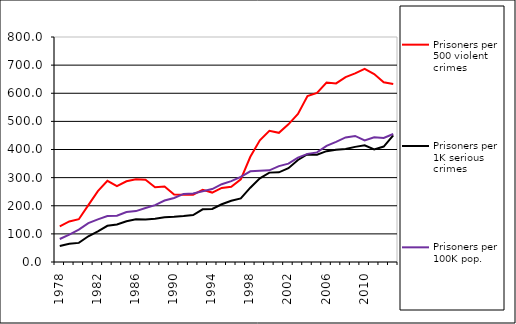
| Category | Prisoners per 500 violent crimes | Prisoners per 1K serious crimes | Prisoners per 100K pop. |
|---|---|---|---|
| 1978.0 | 126.445 | 57.132 | 81.801 |
| 1979.0 | 144.352 | 64.718 | 97.593 |
| 1980.0 | 152.208 | 68.011 | 115.013 |
| 1981.0 | 202.415 | 91.559 | 138.291 |
| 1982.0 | 252.22 | 109.126 | 151.618 |
| 1983.0 | 288.577 | 128.749 | 163.771 |
| 1984.0 | 270.038 | 133.673 | 164.842 |
| 1985.0 | 287.028 | 145.107 | 177.614 |
| 1986.0 | 294.119 | 151.554 | 181.014 |
| 1987.0 | 292.641 | 150.768 | 192.262 |
| 1988.0 | 265.989 | 153.715 | 202.17 |
| 1989.0 | 268.749 | 158.833 | 218.487 |
| 1990.0 | 240.057 | 160.553 | 227.537 |
| 1991.0 | 239.444 | 163.246 | 241.996 |
| 1992.0 | 239.502 | 166.763 | 243.571 |
| 1993.0 | 257.042 | 187.476 | 251.427 |
| 1994.0 | 246.913 | 188.509 | 259.318 |
| 1995.0 | 263.472 | 205.384 | 276.512 |
| 1996.0 | 267.662 | 217.647 | 287.468 |
| 1997.0 | 293.747 | 226.261 | 302.353 |
| 1998.0 | 373.992 | 264.203 | 322.36 |
| 1999.0 | 432.595 | 297.571 | 324.084 |
| 2000.0 | 466.58 | 317.8 | 325.813 |
| 2001.0 | 459.29 | 318.863 | 340.85 |
| 2002.0 | 489.569 | 333.437 | 349.883 |
| 2003.0 | 526.669 | 362.749 | 371.106 |
| 2004.0 | 589.805 | 383.257 | 384.467 |
| 2005.0 | 601.32 | 381.155 | 389.657 |
| 2006.0 | 638.04 | 394.015 | 412.686 |
| 2007.0 | 634.899 | 399.411 | 427.309 |
| 2008.0 | 657.551 | 401.86 | 443.012 |
| 2009.0 | 670.893 | 409.298 | 448.194 |
| 2010.0 | 686.939 | 414.968 | 432.03 |
| 2011.0 | 668.162 | 400.194 | 443.346 |
| 2012.0 | 639.239 | 410.377 | 440.853 |
| 2013.0 | 632.856 | 450.505 | 455.126 |